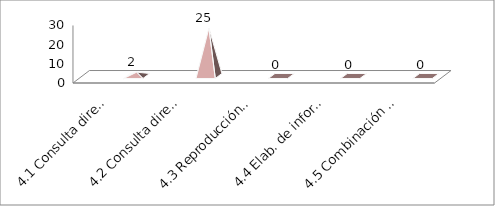
| Category | Series 0 | Series 1 | Series 2 |
|---|---|---|---|
| 4.1 Consulta directa personal |  |  | 2 |
| 4.2 Consulta directa electr. |  |  | 25 |
| 4.3 Reproducción de docs. |  |  | 0 |
| 4.4 Elab. de informe. Específ. |  |  | 0 |
| 4.5 Combinación de las anter. |  |  | 0 |